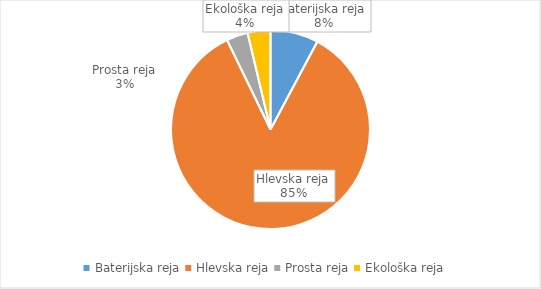
| Category | Količina kosov jajc |
|---|---|
| Baterijska reja | 255676 |
| Hlevska reja | 2790109 |
| Prosta reja | 114734 |
| Ekološka reja | 121810 |